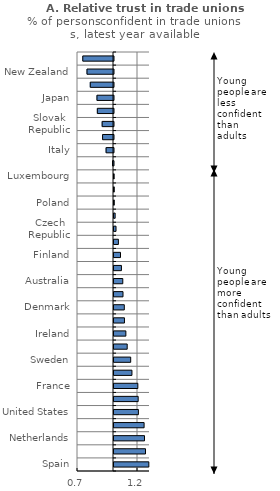
| Category | Latest year |
|---|---|
| Spain | 1.29 |
| United Kingdom | 1.263 |
| Netherlands | 1.254 |
| Latvia | 1.251 |
| United States | 1.203 |
| Slovenia | 1.201 |
| France | 1.199 |
| Colombia | 1.15 |
| Sweden | 1.139 |
| Lithuania | 1.11 |
| Ireland | 1.099 |
| Austria | 1.087 |
| Denmark | 1.086 |
| Hungary | 1.075 |
| Australia | 1.073 |
| Belgium | 1.062 |
| Finland | 1.054 |
| Portugal | 1.037 |
| Czech Republic | 1.017 |
| Germany | 1.01 |
| Poland | 1.002 |
| Mexico | 1.002 |
| Luxembourg | 1.001 |
| Estonia | 0.992 |
| Italy | 0.938 |
| Turkey | 0.909 |
| Slovak Republic | 0.905 |
| Greece | 0.865 |
| Japan | 0.862 |
| Chile | 0.806 |
| New Zealand | 0.779 |
| Korea | 0.744 |